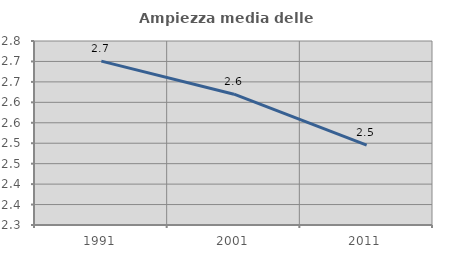
| Category | Ampiezza media delle famiglie |
|---|---|
| 1991.0 | 2.701 |
| 2001.0 | 2.62 |
| 2011.0 | 2.495 |